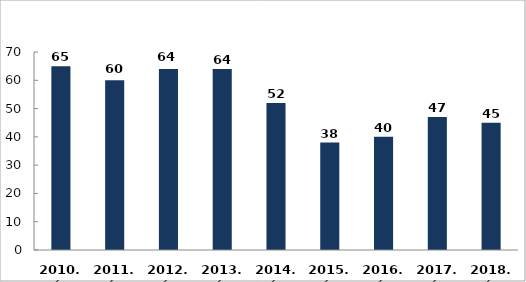
| Category | Ittasan okozott közúti közlekedési balesetek száma |
|---|---|
| 2010. év | 65 |
| 2011. év | 60 |
| 2012. év | 64 |
| 2013. év | 64 |
| 2014. év | 52 |
| 2015. év | 38 |
| 2016. év | 40 |
| 2017. év | 47 |
| 2018. év | 45 |